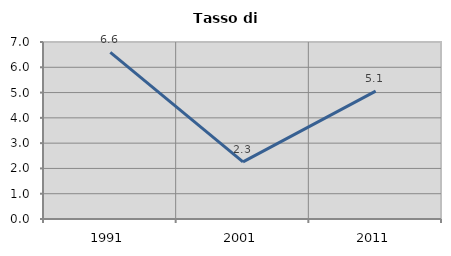
| Category | Tasso di disoccupazione   |
|---|---|
| 1991.0 | 6.589 |
| 2001.0 | 2.259 |
| 2011.0 | 5.056 |